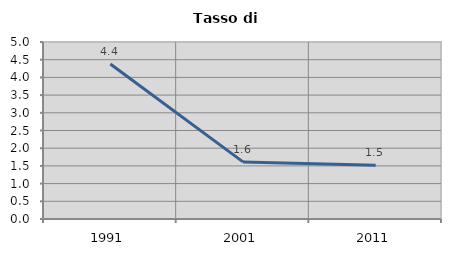
| Category | Tasso di disoccupazione   |
|---|---|
| 1991.0 | 4.377 |
| 2001.0 | 1.613 |
| 2011.0 | 1.516 |